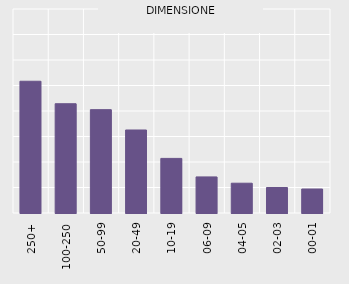
| Category | Series 0 |
|---|---|
| 00-01 | 0.941 |
| 02-03 | 1 |
| 04-05 | 1.168 |
| 06-09 | 1.414 |
| 10-19 | 2.141 |
| 20-49 | 3.255 |
| 50-99 | 4.053 |
| 100-250 | 4.285 |
| 250+ | 5.167 |